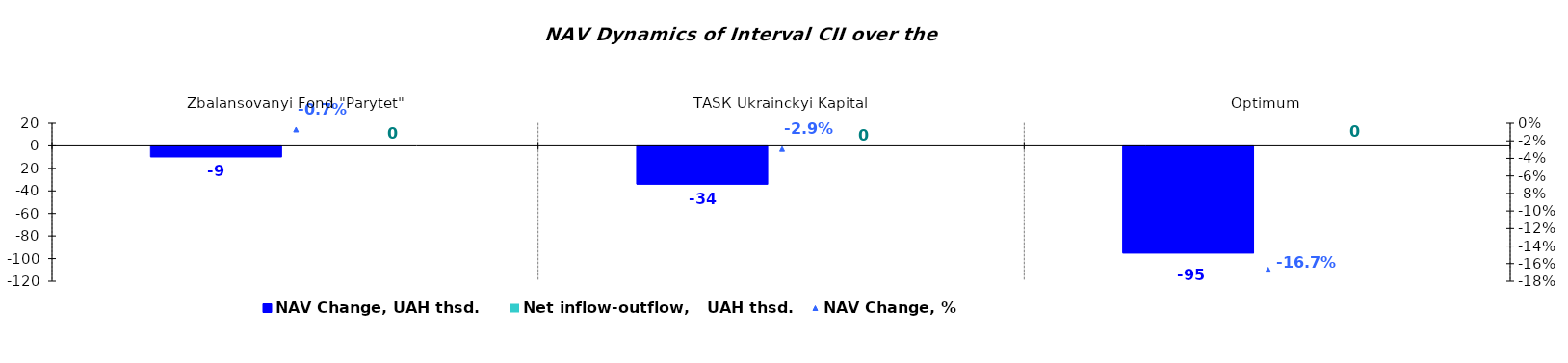
| Category | NAV Change, UAH thsd. | Net inflow-outflow,   UAH thsd. |
|---|---|---|
| Zbalansovanyi Fond "Parytet" | -9.298 | 0 |
| ТАSК Ukrainckyi Kapital | -33.517 | 0 |
| Optimum | -94.592 | 0 |